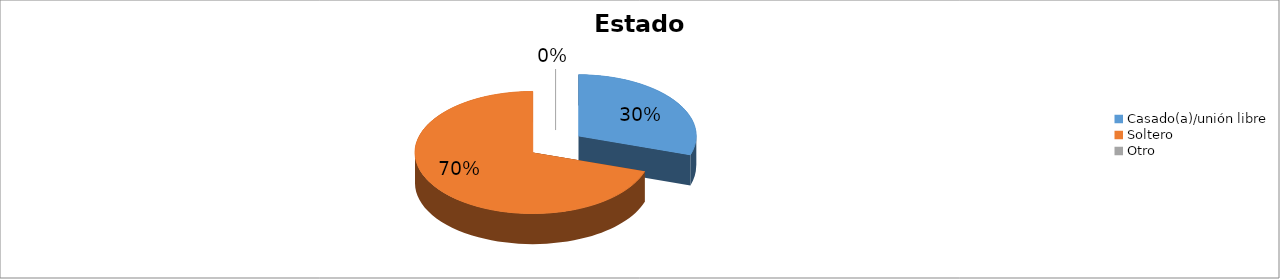
| Category | Series 0 |
|---|---|
| Casado(a)/unión libre | 0.3 |
| Soltero | 0.7 |
| Otro | 0 |